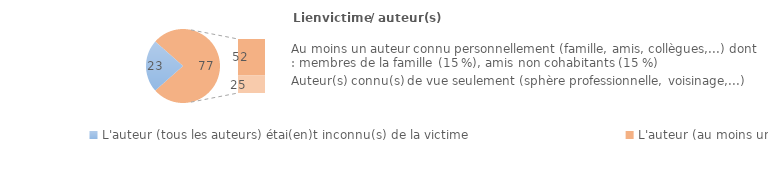
| Category | Series 0 |
|---|---|
| L'auteur (tous les auteurs) étai(en)t inconnu(s) de la victime | 23 |
| Ne sait pas/Refus | 0 |
| L'auteur (au moins un auteur) était connu de vue ou personnellement  | 52 |